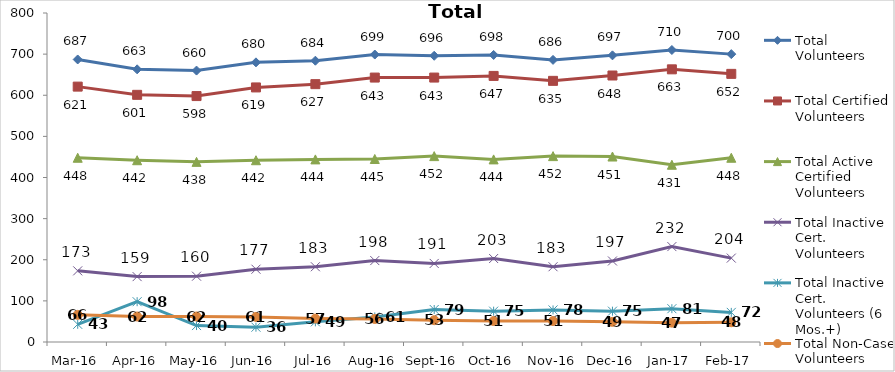
| Category | Total Volunteers | Total Certified Volunteers | Total Active Certified Volunteers | Total Inactive Cert. Volunteers | Total Inactive Cert. Volunteers (6 Mos.+) | Total Non-Case Volunteers |
|---|---|---|---|---|---|---|
| Mar-16 | 687 | 621 | 448 | 173 | 43 | 66 |
| Apr-16 | 663 | 601 | 442 | 159 | 98 | 62 |
| May-16 | 660 | 598 | 438 | 160 | 40 | 62 |
| Jun-16 | 680 | 619 | 442 | 177 | 36 | 61 |
| Jul-16 | 684 | 627 | 444 | 183 | 49 | 57 |
| Aug-16 | 699 | 643 | 445 | 198 | 61 | 56 |
| Sep-16 | 696 | 643 | 452 | 191 | 79 | 53 |
| Oct-16 | 698 | 647 | 444 | 203 | 75 | 51 |
| Nov-16 | 686 | 635 | 452 | 183 | 78 | 51 |
| Dec-16 | 697 | 648 | 451 | 197 | 75 | 49 |
| Jan-17 | 710 | 663 | 431 | 232 | 81 | 47 |
| Feb-17 | 700 | 652 | 448 | 204 | 72 | 48 |